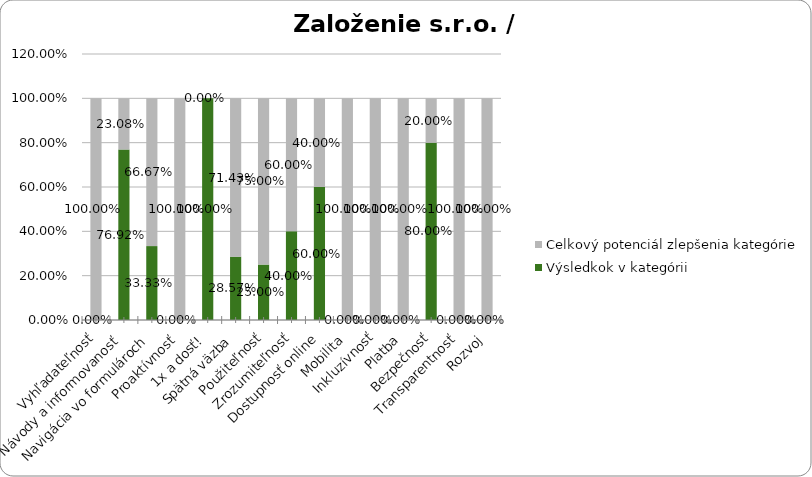
| Category | Výsledkok v kategórii | Celkový potenciál zlepšenia kategórie |
|---|---|---|
| Vyhľadateľnosť | 0 | 1 |
| Návody a informovanosť | 0.769 | 0.231 |
| Navigácia vo formulároch | 0.333 | 0.667 |
| Proaktívnosť | 0 | 1 |
| 1x a dosť! | 1 | 0 |
| Spätná väzba | 0.286 | 0.714 |
| Použiteľnosť | 0.25 | 0.75 |
| Zrozumiteľnosť | 0.4 | 0.6 |
| Dostupnosť online | 0.6 | 0.4 |
| Mobilita | 0 | 1 |
| Inkluzívnosť | 0 | 1 |
| Platba | 0 | 1 |
| Bezpečnosť | 0.8 | 0.2 |
| Transparentnosť | 0 | 1 |
| Rozvoj | 0 | 1 |